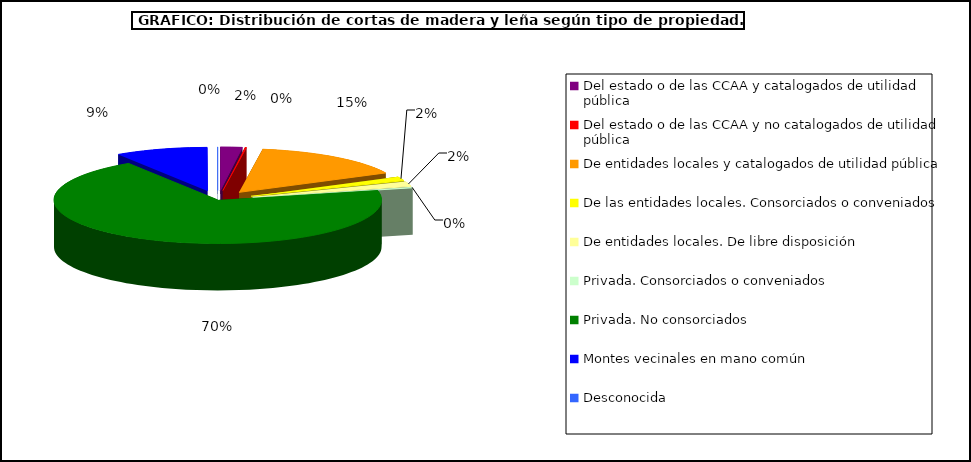
| Category | Series 0 |
|---|---|
| Del estado o de las CCAA y catalogados de utilidad pública | 303965.059 |
| Del estado o de las CCAA y no catalogados de utilidad pública | 20398.33 |
| De entidades locales y catalogados de utilidad pública | 2166518.64 |
| De las entidades locales. Consorciados o conveniados | 218601.839 |
| De entidades locales. De libre disposición | 259357.508 |
| Privada. Consorciados o conveniados | 42778.21 |
| Privada. No consorciados | 9813345.54 |
| Montes vecinales en mano común | 1289649 |
| Desconocida | 4635.058 |